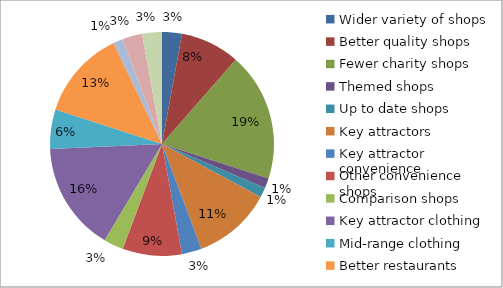
| Category | Series 4 |
|---|---|
| Wider variety of shops | 2 |
| Better quality shops | 6 |
| Fewer charity shops | 13 |
| Themed shops | 1 |
| Up to date shops | 1 |
| Key attractors | 8 |
| Key attractor convenience | 2 |
| Other convenience shops | 6 |
| Comparison shops | 2 |
| Key attractor clothing | 11 |
| Mid-range clothing | 4 |
| Better restaurants | 9 |
| Better pubs / nightlife | 1 |
| Cinema | 2 |
| Better signage | 2 |